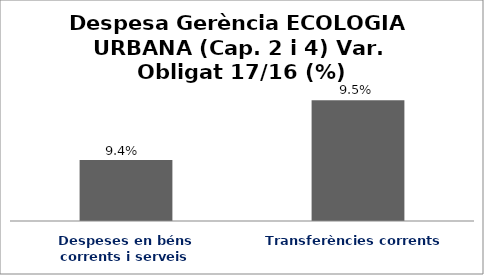
| Category | Series 0 |
|---|---|
| Despeses en béns corrents i serveis | 0.094 |
| Transferències corrents | 0.095 |